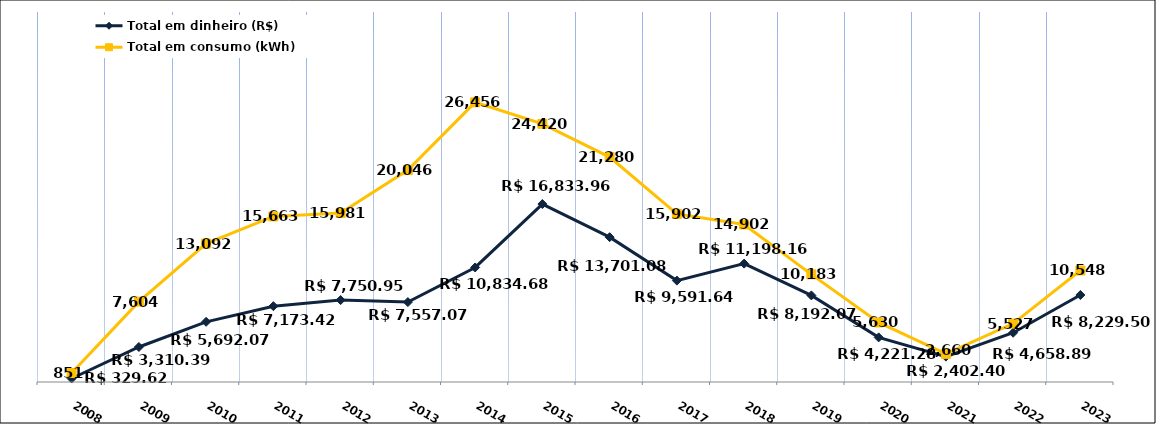
| Category | Total em dinheiro (R$) |
|---|---|
| 2008.0 | 329.62 |
| 2009.0 | 3310.39 |
| 2010.0 | 5692.07 |
| 2011.0 | 7173.42 |
| 2012.0 | 7750.95 |
| 2013.0 | 7557.07 |
| 2014.0 | 10834.68 |
| 2015.0 | 16833.96 |
| 2016.0 | 13701.08 |
| 2017.0 | 9591.64 |
| 2018.0 | 11198.16 |
| 2019.0 | 8192.07 |
| 2020.0 | 4221.28 |
| 2021.0 | 2402.4 |
| 2022.0 | 4658.89 |
| 2023.0 | 8229.5 |